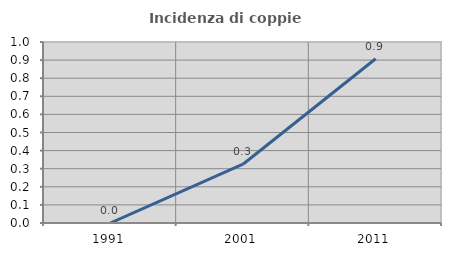
| Category | Incidenza di coppie miste |
|---|---|
| 1991.0 | 0 |
| 2001.0 | 0.325 |
| 2011.0 | 0.907 |